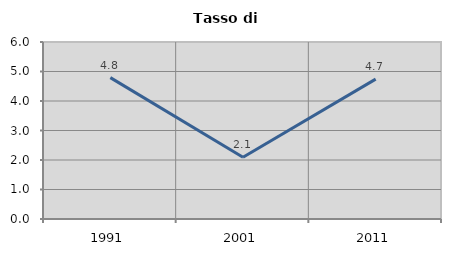
| Category | Tasso di disoccupazione   |
|---|---|
| 1991.0 | 4.793 |
| 2001.0 | 2.093 |
| 2011.0 | 4.742 |